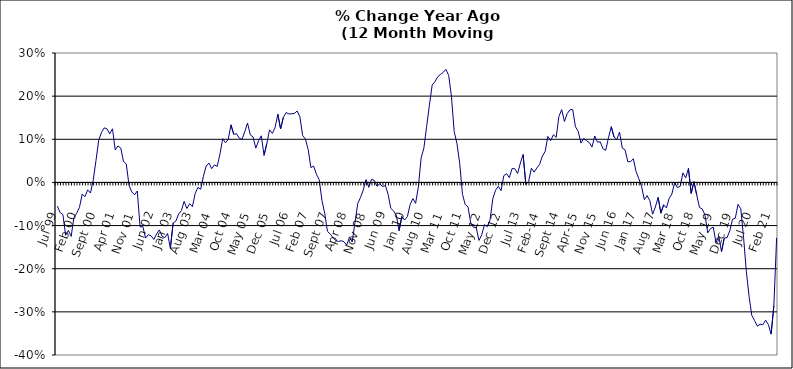
| Category | Series 0 |
|---|---|
| Jul 99 | -0.055 |
| Aug 99 | -0.07 |
| Sep 99 | -0.074 |
| Oct 99 | -0.123 |
| Nov 99 | -0.111 |
| Dec 99 | -0.125 |
| Jan 00 | -0.082 |
| Feb 00 | -0.071 |
| Mar 00 | -0.058 |
| Apr 00 | -0.027 |
| May 00 | -0.033 |
| Jun 00 | -0.017 |
| Jul 00 | -0.025 |
| Aug 00 | 0.005 |
| Sep 00 | 0.05 |
| Oct 00 | 0.098 |
| Nov 00 | 0.116 |
| Dec 00 | 0.127 |
| Jan 01 | 0.124 |
| Feb 01 | 0.113 |
| Mar 01 | 0.124 |
| Apr 01 | 0.075 |
| May 01 | 0.085 |
| Jun 01 | 0.08 |
| Jul 01 | 0.048 |
| Aug 01 | 0.043 |
| Sep 01 | -0.007 |
| Oct 01 | -0.022 |
| Nov 01 | -0.029 |
| Dec 01 | -0.02 |
| Jan 02 | -0.103 |
| Feb 02 | -0.102 |
| Mar 02 | -0.129 |
| Apr 02 | -0.121 |
| May 02 | -0.124 |
| Jun 02 | -0.132 |
| Jul 02 | -0.119 |
| Aug 02 | -0.11 |
| Sep 02 | -0.125 |
| Oct 02 | -0.128 |
| Nov 02 | -0.118 |
| Dec 02 | -0.153 |
| Jan 03 | -0.094 |
| Feb 03 | -0.09 |
| Mar 03 | -0.073 |
| Apr 03 | -0.065 |
| May 03 | -0.044 |
| Jun 03 | -0.06 |
| Jul 03 | -0.049 |
| Aug 03 | -0.056 |
| Sep 03 | -0.026 |
| Oct 03 | -0.012 |
| Nov 03 | -0.016 |
| Dec 03 | 0.014 |
| Jan 04 | 0.038 |
| Feb 04 | 0.045 |
| Mar 04 | 0.032 |
| Apr 04 | 0.041 |
| May 04 | 0.037 |
| Jun 04 | 0.066 |
| Jul 04 | 0.101 |
| Aug 04 | 0.092 |
| Sep 04 | 0.1 |
| Oct 04 | 0.133 |
| Nov 04 | 0.111 |
| Dec 04 | 0.113 |
| Jan 05 | 0.103 |
| Feb 05 | 0.1 |
| Mar 05 | 0.118 |
| Apr 05 | 0.138 |
| May 05 | 0.11 |
| Jun 05 | 0.106 |
| Jul 05 | 0.079 |
| Aug 05 | 0.097 |
| Sep 05 | 0.108 |
| Oct 05 | 0.063 |
| Nov 05 | 0.09 |
| Dec 05 | 0.122 |
| Jan 06 | 0.114 |
| Feb 06 | 0.127 |
| Mar 06 | 0.158 |
| Apr 06 | 0.124 |
| May 06 | 0.151 |
| Jun 06 | 0.162 |
| Jul 06 | 0.159 |
| Aug 06 | 0.159 |
| Sep 06 | 0.16 |
| Oct 06 | 0.166 |
| Nov 06 | 0.152 |
| Dec 06 | 0.109 |
| Jan 07 | 0.101 |
| Feb 07 | 0.076 |
| Mar 07 | 0.034 |
| Apr 07 | 0.038 |
| May 07 | 0.019 |
| Jun 07 | 0.007 |
| Jul 07 | -0.041 |
| Aug 07 | -0.071 |
| Sep 07 | -0.113 |
| Oct 07 | -0.12 |
| Nov 07 | -0.128 |
| Dec 07 | -0.135 |
| Jan 08 | -0.137 |
| Feb 08 | -0.135 |
| Mar 08 | -0.137 |
| Apr 08 | -0.145 |
| May 08 | -0.126 |
| Jun 08 | -0.138 |
| Jul 08 | -0.093 |
| Aug 08 | -0.049 |
| Sep-08 | -0.035 |
| Oct 08 | -0.018 |
| Nov 08 | 0.007 |
| Dec 08 | -0.011 |
| Jan 09 | 0.007 |
| Feb 09 | 0.005 |
| Mar 09 | -0.009 |
| Apr 09 | -0.003 |
| May 09 | -0.01 |
| Jun 09 | -0.007 |
| Jul 09 | -0.027 |
| Aug 09 | -0.06 |
| Sep 09 | -0.066 |
| Oct 09 | -0.076 |
| Nov 09 | -0.112 |
| Dec 09 | -0.079 |
| Jan 10 | -0.087 |
| Feb 10 | -0.079 |
| Mar 10 | -0.052 |
| Apr 10 | -0.037 |
| May 10 | -0.048 |
| Jun 10 | -0.01 |
| Jul 10 | 0.057 |
| Aug 10 | 0.08 |
| Sep 10 | 0.13 |
| Oct 10 | 0.179 |
| Nov 10 | 0.226 |
| Dec 10 | 0.233 |
| Jan 11 | 0.245 |
| Feb 11 | 0.25 |
| Mar 11 | 0.255 |
| Apr 11 | 0.262 |
| May 11 | 0.248 |
| Jun 11 | 0.199 |
| Jul 11 | 0.118 |
| Aug 11 | 0.09 |
| Sep 11 | 0.044 |
| Oct 11 | -0.028 |
| Nov 11 | -0.051 |
| Dec 11 | -0.056 |
| Jan 12 | -0.094 |
| Feb 12 | -0.104 |
| Mar 12 | -0.105 |
| Apr 12 | -0.134 |
| May 12 | -0.121 |
| Jun 12 | -0.098 |
| Jul 12 | -0.103 |
| Aug 12 | -0.087 |
| Sep 12 | -0.038 |
| Oct 12 | -0.018 |
| Nov 12 | -0.009 |
| Dec 12 | -0.019 |
| Jan 13 | 0.016 |
| Feb-13 | 0.02 |
| Mar-13 | 0.011 |
| Apr 13 | 0.032 |
| May 13 | 0.032 |
| Jun-13 | 0.021 |
| Jul 13 | 0.045 |
| Aug 13 | 0.065 |
| Sep 13 | -0.005 |
| Oct 13 | 0.002 |
| Nov 13 | 0.033 |
| Dec 13 | 0.024 |
| Jan 14 | 0.034 |
| Feb-14 | 0.042 |
| Mar 14 | 0.061 |
| Apr 14 | 0.072 |
| May 14 | 0.107 |
| Jun 14 | 0.097 |
| Jul-14 | 0.111 |
| Aug-14 | 0.105 |
| Sep 14 | 0.153 |
| Oct 14 | 0.169 |
| Nov 14 | 0.141 |
| Dec 14 | 0.159 |
| Jan 15 | 0.169 |
| Feb 15 | 0.169 |
| Mar 15 | 0.129 |
| Apr-15 | 0.118 |
| May 15 | 0.091 |
| Jun-15 | 0.102 |
| Jul 15 | 0.097 |
| Aug 15 | 0.092 |
| Sep 15 | 0.082 |
| Oct 15 | 0.108 |
| Nov 15 | 0.093 |
| Dec 15 | 0.094 |
| Jan 16 | 0.078 |
| Feb 16 | 0.075 |
| Mar 16 | 0.104 |
| Apr 16 | 0.129 |
| May 16 | 0.105 |
| Jun 16 | 0.1 |
| Jul 16 | 0.117 |
| Aug 16 | 0.08 |
| Sep 16 | 0.076 |
| Oct 16 | 0.048 |
| Nov 16 | 0.048 |
| Dec 16 | 0.055 |
| Jan 17 | 0.025 |
| Feb 17 | 0.009 |
| Mar 17 | -0.01 |
| Apr 17 | -0.04 |
| May 17 | -0.031 |
| Jun 17 | -0.042 |
| Jul 17 | -0.074 |
| Aug 17 | -0.057 |
| Sep 17 | -0.035 |
| Oct 17 | -0.071 |
| Nov 17 | -0.052 |
| Dec 17 | -0.059 |
| Jan 18 | -0.037 |
| Feb 18 | -0.027 |
| Mar 18 | 0 |
| Apr 18 | -0.012 |
| May 18 | -0.009 |
| Jun 18 | 0.022 |
| Jul 18 | 0.01 |
| Aug 18 | 0.033 |
| Sep 18 | -0.025 |
| Oct 18 | 0.002 |
| Nov 18 | -0.029 |
| Dec 18 | -0.058 |
| Jan 19 | -0.061 |
| Feb 19 | -0.075 |
| Mar 19 | -0.117 |
| Apr 19 | -0.107 |
| May 19 | -0.104 |
| Jun 19 | -0.139 |
| Jul 19 | -0.124 |
| Aug 19 | -0.16 |
| Sep 19 | -0.129 |
| Oct 19 | -0.128 |
| Nov 19 | -0.112 |
| Dec 19 | -0.085 |
| Jan 20 | -0.083 |
| Feb 20 | -0.051 |
| Mar 20 | -0.061 |
| Apr 20 | -0.127 |
| May 20 | -0.206 |
| Jun 20 | -0.264 |
| Jul 20 | -0.308 |
| Aug 20 | -0.32 |
| Sep 20 | -0.333 |
| Oct 20 | -0.329 |
| Nov 20 | -0.33 |
| Dec 20 | -0.319 |
| Jan 21 | -0.329 |
| Feb 21 | -0.352 |
| Mar 21 | -0.286 |
| Apr 21 | -0.129 |